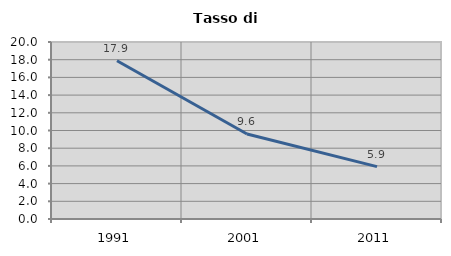
| Category | Tasso di disoccupazione   |
|---|---|
| 1991.0 | 17.882 |
| 2001.0 | 9.605 |
| 2011.0 | 5.918 |